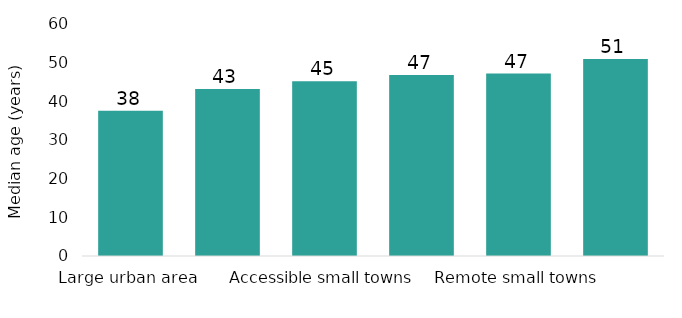
| Category | Persons |
|---|---|
| Large urban area | 37.594 |
| Other urban area | 43.175 |
| Accessible small towns | 45.218 |
| Accessible rural | 46.778 |
| Remote small towns | 47.173 |
| Remote rural | 50.972 |